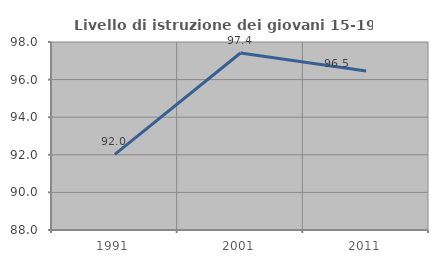
| Category | Livello di istruzione dei giovani 15-19 anni |
|---|---|
| 1991.0 | 92.023 |
| 2001.0 | 97.416 |
| 2011.0 | 96.463 |